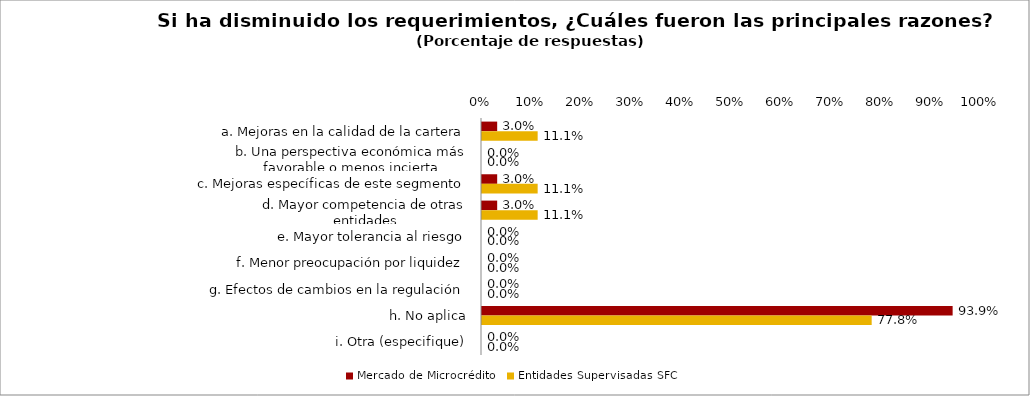
| Category | Mercado de Microcrédito | Entidades Supervisadas SFC |
|---|---|---|
| a. Mejoras en la calidad de la cartera | 0.03 | 0.111 |
| b. Una perspectiva económica más favorable o menos incierta | 0 | 0 |
| c. Mejoras específicas de este segmento | 0.03 | 0.111 |
| d. Mayor competencia de otras entidades | 0.03 | 0.111 |
| e. Mayor tolerancia al riesgo | 0 | 0 |
| f. Menor preocupación por liquidez | 0 | 0 |
| g. Efectos de cambios en la regulación | 0 | 0 |
| h. No aplica | 0.939 | 0.778 |
| i. Otra (especifique) | 0 | 0 |